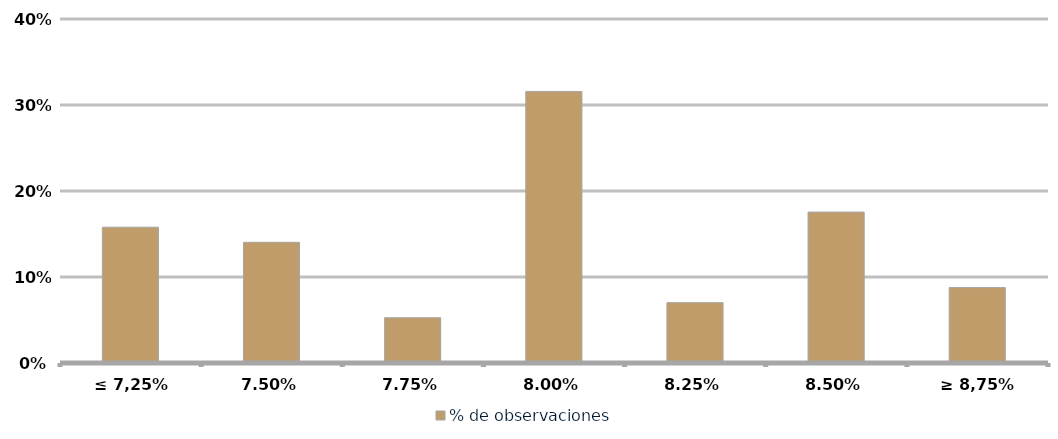
| Category | % de observaciones  |
|---|---|
| ≤ 7,25% | 0.158 |
| 7,50% | 0.14 |
| 7,75% | 0.053 |
| 8,00% | 0.316 |
| 8,25% | 0.07 |
| 8,50% | 0.175 |
| ≥ 8,75% | 0.088 |